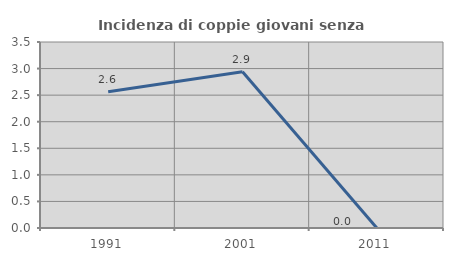
| Category | Incidenza di coppie giovani senza figli |
|---|---|
| 1991.0 | 2.564 |
| 2001.0 | 2.941 |
| 2011.0 | 0 |